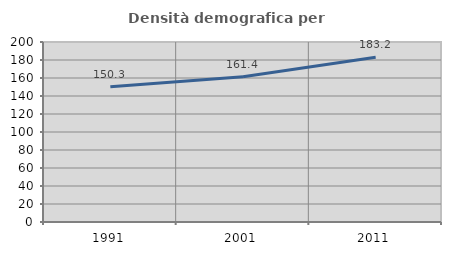
| Category | Densità demografica |
|---|---|
| 1991.0 | 150.343 |
| 2001.0 | 161.427 |
| 2011.0 | 183.154 |